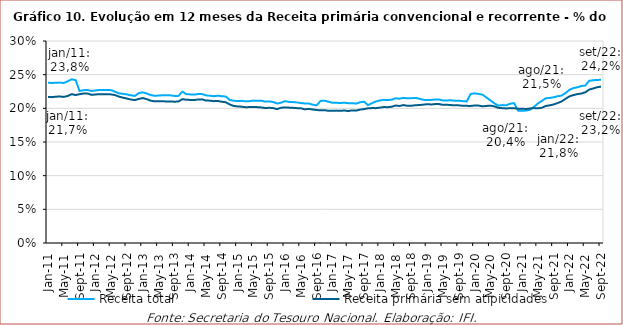
| Category | Receita total | Receita primária sem atipicidades |
|---|---|---|
| 2011-01-01 | 0.238 | 0.217 |
| 2011-02-01 | 0.238 | 0.217 |
| 2011-03-01 | 0.238 | 0.217 |
| 2011-04-01 | 0.238 | 0.218 |
| 2011-05-01 | 0.238 | 0.217 |
| 2011-06-01 | 0.24 | 0.218 |
| 2011-07-01 | 0.243 | 0.221 |
| 2011-08-01 | 0.242 | 0.22 |
| 2011-09-01 | 0.226 | 0.221 |
| 2011-10-01 | 0.227 | 0.222 |
| 2011-11-01 | 0.227 | 0.222 |
| 2011-12-01 | 0.226 | 0.22 |
| 2012-01-01 | 0.227 | 0.221 |
| 2012-02-01 | 0.227 | 0.221 |
| 2012-03-01 | 0.227 | 0.221 |
| 2012-04-01 | 0.227 | 0.221 |
| 2012-05-01 | 0.227 | 0.221 |
| 2012-06-01 | 0.225 | 0.22 |
| 2012-07-01 | 0.222 | 0.217 |
| 2012-08-01 | 0.222 | 0.216 |
| 2012-09-01 | 0.221 | 0.214 |
| 2012-10-01 | 0.219 | 0.213 |
| 2012-11-01 | 0.218 | 0.212 |
| 2012-12-01 | 0.223 | 0.214 |
| 2013-01-01 | 0.224 | 0.215 |
| 2013-02-01 | 0.222 | 0.214 |
| 2013-03-01 | 0.22 | 0.211 |
| 2013-04-01 | 0.219 | 0.21 |
| 2013-05-01 | 0.219 | 0.211 |
| 2013-06-01 | 0.219 | 0.211 |
| 2013-07-01 | 0.219 | 0.21 |
| 2013-08-01 | 0.219 | 0.21 |
| 2013-09-01 | 0.218 | 0.21 |
| 2013-10-01 | 0.218 | 0.21 |
| 2013-11-01 | 0.225 | 0.214 |
| 2013-12-01 | 0.221 | 0.213 |
| 2014-01-01 | 0.221 | 0.212 |
| 2014-02-01 | 0.22 | 0.212 |
| 2014-03-01 | 0.221 | 0.213 |
| 2014-04-01 | 0.221 | 0.213 |
| 2014-05-01 | 0.219 | 0.212 |
| 2014-06-01 | 0.219 | 0.211 |
| 2014-07-01 | 0.218 | 0.211 |
| 2014-08-01 | 0.219 | 0.211 |
| 2014-09-01 | 0.218 | 0.21 |
| 2014-10-01 | 0.218 | 0.209 |
| 2014-11-01 | 0.212 | 0.206 |
| 2014-12-01 | 0.211 | 0.204 |
| 2015-01-01 | 0.211 | 0.203 |
| 2015-02-01 | 0.211 | 0.202 |
| 2015-03-01 | 0.21 | 0.202 |
| 2015-04-01 | 0.211 | 0.202 |
| 2015-05-01 | 0.211 | 0.202 |
| 2015-06-01 | 0.211 | 0.202 |
| 2015-07-01 | 0.211 | 0.201 |
| 2015-08-01 | 0.21 | 0.2 |
| 2015-09-01 | 0.21 | 0.201 |
| 2015-10-01 | 0.209 | 0.2 |
| 2015-11-01 | 0.207 | 0.199 |
| 2015-12-01 | 0.208 | 0.201 |
| 2016-01-01 | 0.211 | 0.201 |
| 2016-02-01 | 0.21 | 0.201 |
| 2016-03-01 | 0.209 | 0.201 |
| 2016-04-01 | 0.209 | 0.2 |
| 2016-05-01 | 0.208 | 0.2 |
| 2016-06-01 | 0.207 | 0.199 |
| 2016-07-01 | 0.207 | 0.199 |
| 2016-08-01 | 0.205 | 0.198 |
| 2016-09-01 | 0.204 | 0.198 |
| 2016-10-01 | 0.211 | 0.197 |
| 2016-11-01 | 0.211 | 0.197 |
| 2016-12-01 | 0.21 | 0.196 |
| 2017-01-01 | 0.208 | 0.197 |
| 2017-02-01 | 0.208 | 0.197 |
| 2017-03-01 | 0.208 | 0.196 |
| 2017-04-01 | 0.208 | 0.197 |
| 2017-05-01 | 0.208 | 0.196 |
| 2017-06-01 | 0.208 | 0.197 |
| 2017-07-01 | 0.207 | 0.197 |
| 2017-08-01 | 0.209 | 0.198 |
| 2017-09-01 | 0.21 | 0.199 |
| 2017-10-01 | 0.205 | 0.2 |
| 2017-11-01 | 0.208 | 0.2 |
| 2017-12-01 | 0.21 | 0.2 |
| 2018-01-01 | 0.212 | 0.201 |
| 2018-02-01 | 0.213 | 0.202 |
| 2018-03-01 | 0.212 | 0.202 |
| 2018-04-01 | 0.213 | 0.202 |
| 2018-05-01 | 0.215 | 0.204 |
| 2018-06-01 | 0.214 | 0.204 |
| 2018-07-01 | 0.216 | 0.205 |
| 2018-08-01 | 0.215 | 0.204 |
| 2018-09-01 | 0.215 | 0.204 |
| 2018-10-01 | 0.215 | 0.205 |
| 2018-11-01 | 0.214 | 0.205 |
| 2018-12-01 | 0.213 | 0.205 |
| 2019-01-01 | 0.212 | 0.206 |
| 2019-02-01 | 0.213 | 0.206 |
| 2019-03-01 | 0.213 | 0.206 |
| 2019-04-01 | 0.213 | 0.206 |
| 2019-05-01 | 0.212 | 0.205 |
| 2019-06-01 | 0.212 | 0.205 |
| 2019-07-01 | 0.212 | 0.205 |
| 2019-08-01 | 0.211 | 0.205 |
| 2019-09-01 | 0.211 | 0.204 |
| 2019-10-01 | 0.211 | 0.204 |
| 2019-11-01 | 0.21 | 0.204 |
| 2019-12-01 | 0.221 | 0.204 |
| 2020-01-01 | 0.222 | 0.204 |
| 2020-02-01 | 0.221 | 0.204 |
| 2020-03-01 | 0.22 | 0.203 |
| 2020-04-01 | 0.216 | 0.204 |
| 2020-05-01 | 0.212 | 0.204 |
| 2020-06-01 | 0.207 | 0.203 |
| 2020-07-01 | 0.204 | 0.201 |
| 2020-08-01 | 0.205 | 0.2 |
| 2020-09-01 | 0.205 | 0.2 |
| 2020-10-01 | 0.207 | 0.2 |
| 2020-11-01 | 0.208 | 0.2 |
| 2020-12-01 | 0.197 | 0.199 |
| 2021-01-01 | 0.196 | 0.2 |
| 2021-02-01 | 0.197 | 0.199 |
| 2021-03-01 | 0.198 | 0.2 |
| 2021-04-01 | 0.202 | 0.2 |
| 2021-05-01 | 0.207 | 0.2 |
| 2021-06-01 | 0.211 | 0.201 |
| 2021-07-01 | 0.215 | 0.204 |
| 2021-08-01 | 0.215 | 0.204 |
| 2021-09-01 | 0.216 | 0.206 |
| 2021-10-01 | 0.218 | 0.208 |
| 2021-11-01 | 0.219 | 0.21 |
| 2021-12-01 | 0.223 | 0.214 |
| 2022-01-01 | 0.227 | 0.218 |
| 2022-02-01 | 0.23 | 0.22 |
| 2022-03-01 | 0.231 | 0.221 |
| 2022-04-01 | 0.233 | 0.222 |
| 2022-05-01 | 0.234 | 0.224 |
| 2022-06-01 | 0.241 | 0.228 |
| 2022-07-01 | 0.242 | 0.229 |
| 2022-08-01 | 0.242 | 0.231 |
| 2022-09-01 | 0.242 | 0.232 |